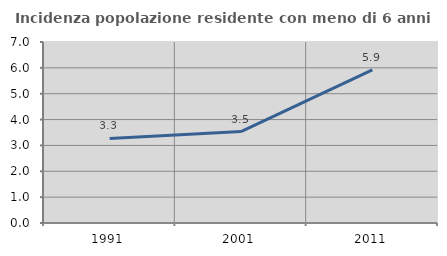
| Category | Incidenza popolazione residente con meno di 6 anni |
|---|---|
| 1991.0 | 3.268 |
| 2001.0 | 3.538 |
| 2011.0 | 5.923 |